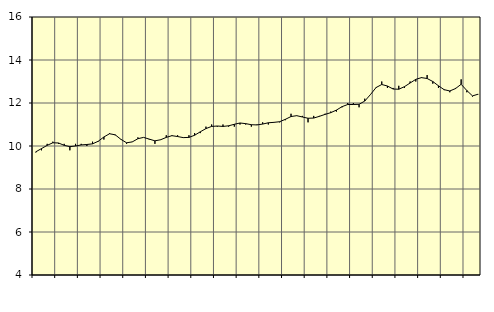
| Category | Piggar | Utbildning, SNI 85 |
|---|---|---|
| nan | 9.7 | 9.73 |
| 1.0 | 9.8 | 9.88 |
| 1.0 | 10.1 | 10.03 |
| 1.0 | 10.2 | 10.15 |
| nan | 10.1 | 10.14 |
| 2.0 | 10.1 | 10.03 |
| 2.0 | 9.8 | 9.97 |
| 2.0 | 10.1 | 10 |
| nan | 10.1 | 10.05 |
| 3.0 | 10 | 10.07 |
| 3.0 | 10.2 | 10.1 |
| 3.0 | 10.2 | 10.22 |
| nan | 10.3 | 10.42 |
| 4.0 | 10.6 | 10.57 |
| 4.0 | 10.5 | 10.52 |
| 4.0 | 10.3 | 10.31 |
| nan | 10.1 | 10.15 |
| 5.0 | 10.2 | 10.19 |
| 5.0 | 10.4 | 10.34 |
| 5.0 | 10.4 | 10.4 |
| nan | 10.3 | 10.32 |
| 6.0 | 10.1 | 10.24 |
| 6.0 | 10.3 | 10.29 |
| 6.0 | 10.5 | 10.4 |
| nan | 10.5 | 10.48 |
| 7.0 | 10.5 | 10.44 |
| 7.0 | 10.4 | 10.39 |
| 7.0 | 10.5 | 10.4 |
| nan | 10.6 | 10.5 |
| 8.0 | 10.6 | 10.66 |
| 8.0 | 10.9 | 10.81 |
| 8.0 | 11 | 10.91 |
| nan | 10.9 | 10.93 |
| 9.0 | 11 | 10.91 |
| 9.0 | 10.9 | 10.94 |
| 9.0 | 10.9 | 11.01 |
| nan | 11 | 11.07 |
| 10.0 | 11 | 11.04 |
| 10.0 | 10.9 | 10.99 |
| 10.0 | 11 | 10.98 |
| nan | 11.1 | 11.02 |
| 11.0 | 11 | 11.08 |
| 11.0 | 11.1 | 11.1 |
| 11.0 | 11.1 | 11.13 |
| nan | 11.2 | 11.24 |
| 12.0 | 11.5 | 11.37 |
| 12.0 | 11.4 | 11.41 |
| 12.0 | 11.4 | 11.35 |
| nan | 11.1 | 11.29 |
| 13.0 | 11.4 | 11.3 |
| 13.0 | 11.4 | 11.38 |
| 13.0 | 11.5 | 11.47 |
| nan | 11.6 | 11.55 |
| 14.0 | 11.6 | 11.67 |
| 14.0 | 11.8 | 11.83 |
| 14.0 | 12 | 11.93 |
| nan | 12 | 11.93 |
| 15.0 | 11.8 | 11.94 |
| 15.0 | 12.2 | 12.09 |
| 15.0 | 12.4 | 12.39 |
| nan | 12.7 | 12.72 |
| 16.0 | 13 | 12.86 |
| 16.0 | 12.7 | 12.79 |
| 16.0 | 12.7 | 12.65 |
| nan | 12.8 | 12.64 |
| 17.0 | 12.7 | 12.76 |
| 17.0 | 13 | 12.93 |
| 17.0 | 13 | 13.1 |
| nan | 13.2 | 13.18 |
| 18.0 | 13.3 | 13.14 |
| 18.0 | 12.9 | 13 |
| 18.0 | 12.7 | 12.8 |
| nan | 12.6 | 12.62 |
| 19.0 | 12.5 | 12.56 |
| 19.0 | 12.7 | 12.67 |
| 19.0 | 13.1 | 12.87 |
| nan | 12.5 | 12.58 |
| 20.0 | 12.3 | 12.33 |
| 20.0 | 12.4 | 12.41 |